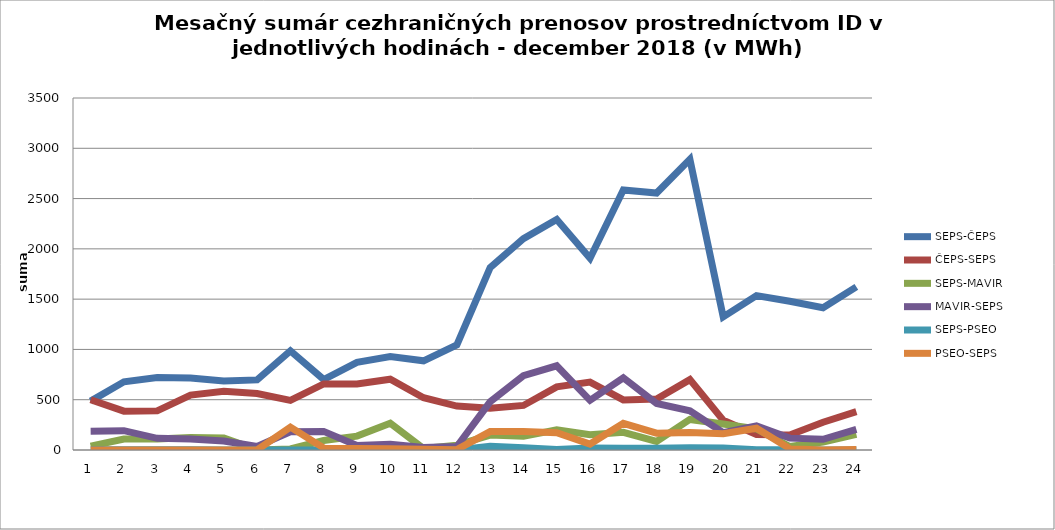
| Category | SEPS-ČEPS | ČEPS-SEPS | SEPS-MAVIR | MAVIR-SEPS | SEPS-PSEO | PSEO-SEPS |
|---|---|---|---|---|---|---|
| 1.0 | 486 | 500 | 39 | 187 | 2 | 0 |
| 2.0 | 678 | 386 | 109 | 192 | 2 | 0 |
| 3.0 | 720 | 389 | 110 | 116 | 2 | 0 |
| 4.0 | 715 | 546 | 124 | 110 | 2 | 0 |
| 5.0 | 686 | 583 | 119 | 90 | 0 | 0 |
| 6.0 | 697 | 561 | 1 | 36 | 0 | 0 |
| 7.0 | 985 | 494 | 10 | 181 | 0 | 228 |
| 8.0 | 701 | 657 | 94 | 185 | 0 | 20 |
| 9.0 | 872 | 656 | 138 | 46 | 0 | 14 |
| 10.0 | 929 | 704 | 267 | 58 | 0 | 12 |
| 11.0 | 887 | 520 | 14 | 24 | 0 | 7 |
| 12.0 | 1046 | 437 | 48 | 35 | 0 | 3 |
| 13.0 | 1814 | 415 | 148 | 479 | 38 | 183 |
| 14.0 | 2101 | 443 | 136 | 739 | 23 | 183 |
| 15.0 | 2292 | 628 | 201 | 837 | 5 | 172 |
| 16.0 | 1907 | 675 | 152 | 494 | 21 | 59 |
| 17.0 | 2586 | 498 | 176 | 718 | 18 | 265 |
| 18.0 | 2555 | 508 | 86 | 463 | 18 | 167 |
| 19.0 | 2890 | 700 | 304 | 390 | 22 | 173 |
| 20.0 | 1324 | 296 | 258 | 173 | 19 | 161 |
| 21.0 | 1535 | 153 | 209 | 239 | 3 | 217 |
| 22.0 | 1479 | 149 | 34 | 118 | 3 | 13 |
| 23.0 | 1415 | 276 | 79 | 107 | 0 | 0 |
| 24.0 | 1622 | 382 | 156 | 204 | 0 | 5 |